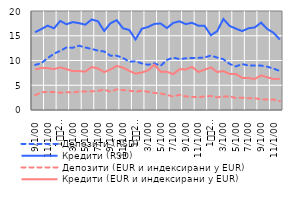
| Category | Депозити (RSD) | Кредити (RSD) | Депозити (EUR и индексирани у EUR) | Кредити (EUR и индексирани у EUR) |
|---|---|---|---|---|
| 9 | 9.1 | 15.72 | 2.99 | 8.2 |
| 10 | 9.48 | 16.36 | 3.58 | 8.47 |
| 11 | 10.49 | 17.04 | 3.66 | 8.46 |
| 12 | 11.36 | 16.5 | 3.64 | 8.26 |
| 1
2011. | 11.96 | 17.99 | 3.48 | 8.61 |
| 2 | 12.63 | 17.32 | 3.6 | 8.25 |
| 3 | 12.57 | 17.76 | 3.52 | 7.85 |
| 4 | 12.99 | 17.54 | 3.75 | 7.86 |
| 5 | 12.63 | 17.24 | 3.76 | 7.75 |
| 6 | 12.34 | 18.28 | 3.78 | 8.68 |
| 7 | 12 | 17.94 | 3.86 | 8.41 |
| 8 | 11.82 | 15.96 | 4.1 | 7.65 |
| 9 | 10.98 | 17.51 | 3.71 | 8.18 |
| 10 | 10.97 | 18.16 | 4.18 | 8.91 |
| 11 | 10.52 | 16.5 | 4.02 | 8.57 |
| 12 | 9.76 | 16.17 | 3.92 | 7.91 |
| 1
2012. | 9.85 | 14.25 | 3.69 | 7.36 |
| 2 | 9.41 | 16.42 | 3.89 | 7.57 |
| 3 | 9.13 | 16.78 | 3.67 | 8 |
| 4 | 9.43 | 17.39 | 3.45 | 9.16 |
| 5 | 8.92 | 17.48 | 3.33 | 7.72 |
| 6 | 10.12 | 16.55 | 3.08 | 7.73 |
| 7 | 10.58 | 17.59 | 2.7 | 7.24 |
| 8 | 10.29 | 17.92 | 3.09 | 8.22 |
| 9 | 10.43 | 17.35 | 2.75 | 8.2 |
| 10 | 10.53 | 17.62 | 2.66 | 8.72 |
| 11 | 10.53 | 17.04 | 2.58 | 7.68 |
| 12 | 10.6 | 17.01 | 2.73 | 8.15 |
| 1
2013. | 11 | 15.1 | 2.84 | 8.6 |
| 2 | 10.6 | 15.92 | 2.55 | 7.67 |
| 3 | 10.26 | 18.39 | 2.71 | 7.87 |
| 4 | 9.3 | 16.98 | 2.76 | 7.25 |
| 5 | 8.81 | 16.43 | 2.42 | 7.29 |
| 6 | 9.28 | 15.94 | 2.5 | 6.48 |
| 7 | 8.99 | 16.52 | 2.38 | 6.47 |
| 8 | 8.97 | 16.67 | 2.39 | 6.27 |
| 9 | 8.97 | 17.65 | 2.13 | 6.98 |
| 10 | 8.75 | 16.36 | 2.11 | 6.62 |
| 11 | 8.35 | 15.6 | 2.1 | 6.24 |
| 12 | 7.88 | 14.22 | 1.79 | 6.33 |